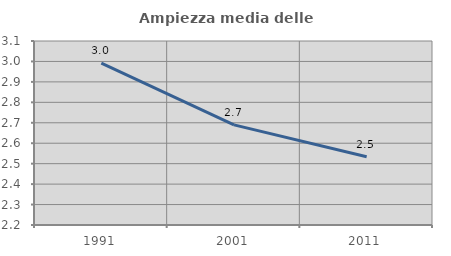
| Category | Ampiezza media delle famiglie |
|---|---|
| 1991.0 | 2.992 |
| 2001.0 | 2.69 |
| 2011.0 | 2.534 |